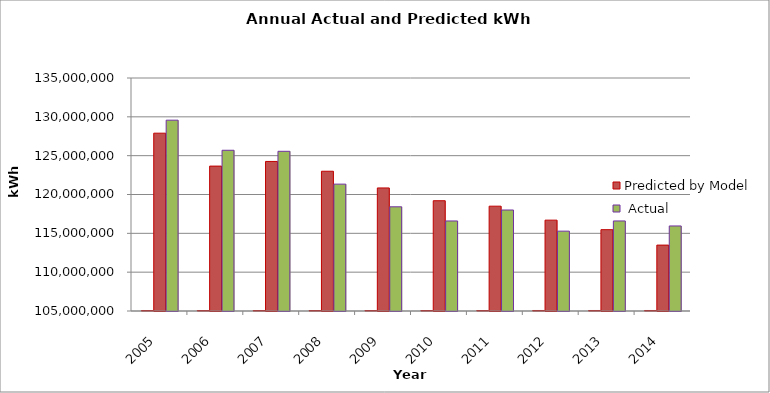
| Category | Year | Predicted by Model |  Actual |
|---|---|---|---|
| 2005.0 | 2005 | 127895969.186 | 129569190 |
| 2006.0 | 2006 | 123655943.027 | 125693570 |
| 2007.0 | 2007 | 124256671.94 | 125561560 |
| 2008.0 | 2008 | 122993570.235 | 121334640 |
| 2009.0 | 2009 | 120843116.167 | 118414830 |
| 2010.0 | 2010 | 119197602.832 | 116592701 |
| 2011.0 | 2011 | 118496807.496 | 118002442 |
| 2012.0 | 2012 | 116698166.712 | 115281047 |
| 2013.0 | 2013 | 115471991.303 | 116595466 |
| 2014.0 | 2014 | 113484155.103 | 115948548 |